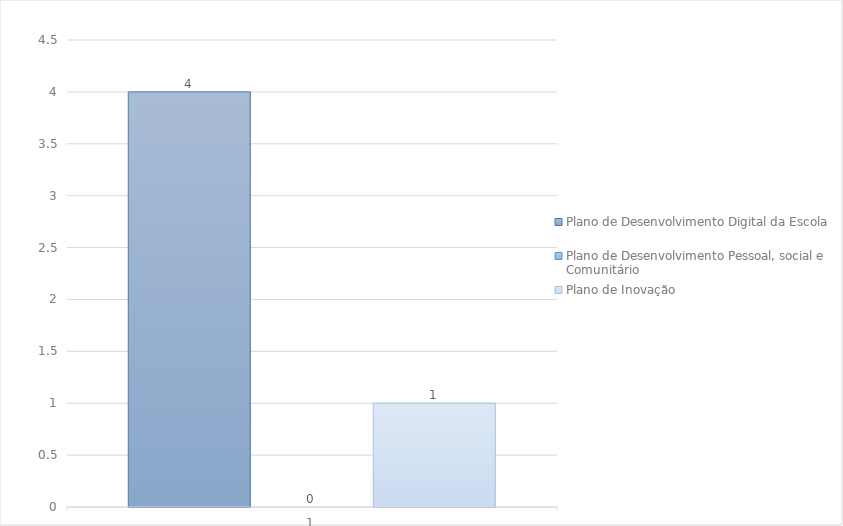
| Category | Plano de Desenvolvimento Digital da Escola | Plano de Desenvolvimento Pessoal, social e Comunitário | Plano de Inovação |
|---|---|---|---|
| 0 | 4 | 0 | 1 |